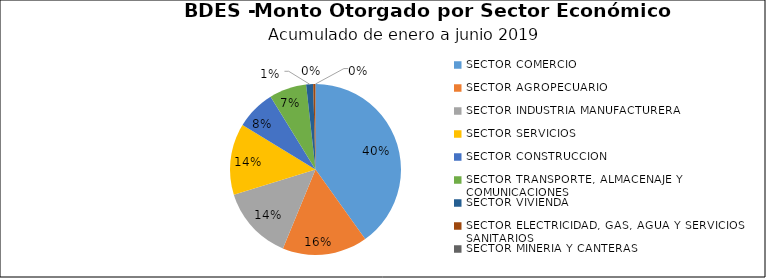
| Category | Monto | Créditos |
|---|---|---|
| SECTOR COMERCIO | 42.322 | 1303 |
| SECTOR AGROPECUARIO | 16.972 | 578 |
| SECTOR INDUSTRIA MANUFACTURERA | 14.772 | 260 |
| SECTOR SERVICIOS | 14.234 | 213 |
| SECTOR CONSTRUCCION | 7.882 | 422 |
| SECTOR TRANSPORTE, ALMACENAJE Y COMUNICACIONES | 7.427 | 262 |
| SECTOR VIVIENDA | 1.394 | 112 |
| SECTOR ELECTRICIDAD, GAS, AGUA Y SERVICIOS SANITARIOS | 0.446 | 1 |
| SECTOR MINERIA Y CANTERAS | 0.012 | 2 |